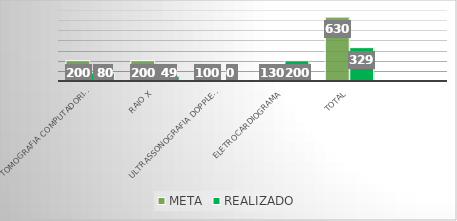
| Category | META | REALIZADO |
|---|---|---|
| Tomografia computadorizada | 200 | 80 |
| Raio x | 200 | 49 |
| Ultrassonografia Doppler  | 100 | 0 |
| Eletrocardiograma | 130 | 200 |
| Total | 630 | 329 |